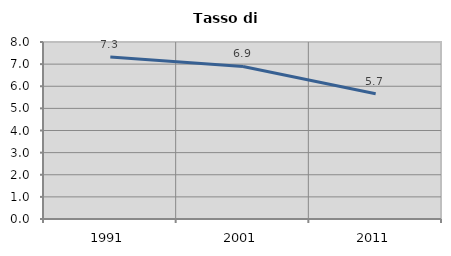
| Category | Tasso di disoccupazione   |
|---|---|
| 1991.0 | 7.317 |
| 2001.0 | 6.897 |
| 2011.0 | 5.66 |